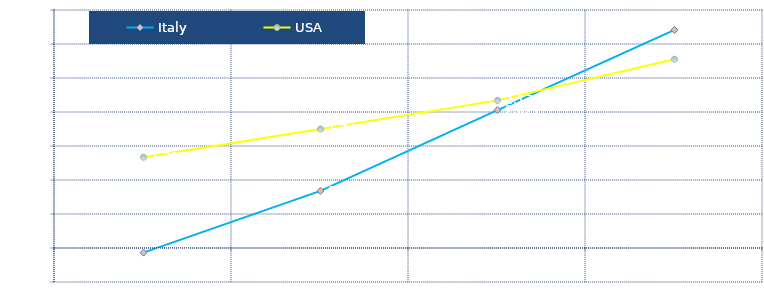
| Category | Italy | USA |
|---|---|---|
| 2-yr | -0.068 | 1.335 |
| 5-yr | 0.84 | 1.749 |
| 10-yr | 2.027 | 2.171 |
| 30-yr | 3.207 | 2.776 |